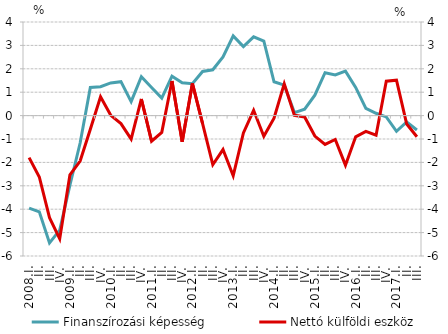
| Category | Finanszírozási képesség |
|---|---|
| 2008.I. | -3.953 |
| II. | -4.111 |
| III. | -5.439 |
| IV. | -4.897 |
| 2009.I. | -2.976 |
| II. | -1.172 |
| III. | 1.202 |
| IV. | 1.236 |
| 2010.I. | 1.395 |
| II. | 1.45 |
| III. | 0.599 |
| IV. | 1.66 |
| 2011.I. | 1.204 |
| II. | 0.75 |
| III. | 1.683 |
| IV. | 1.401 |
| 2012.I. | 1.365 |
| II. | 1.886 |
| III. | 1.959 |
| IV. | 2.504 |
| 2013.I. | 3.407 |
| II. | 2.95 |
| III. | 3.365 |
| IV. | 3.188 |
| 2014.I. | 1.447 |
| II. | 1.304 |
| III. | 0.127 |
| IV. | 0.272 |
| 2015.I. | 0.874 |
| II. | 1.835 |
| III. | 1.736 |
| IV. | 1.898 |
| 2016.I. | 1.205 |
| II. | 0.304 |
| III. | 0.099 |
| IV. | -0.056 |
| 2017.I. | -0.673 |
| II. | -0.271 |
| III. | -0.615 |